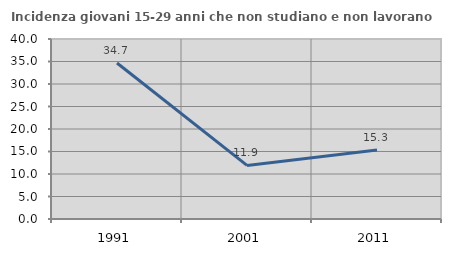
| Category | Incidenza giovani 15-29 anni che non studiano e non lavorano  |
|---|---|
| 1991.0 | 34.667 |
| 2001.0 | 11.913 |
| 2011.0 | 15.311 |